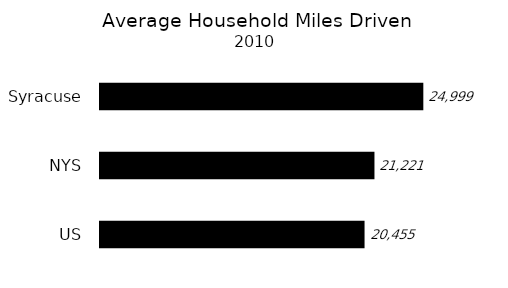
| Category | Series 0 |
|---|---|
| US | 20455 |
| NYS | 21221 |
| Syracuse | 24999 |